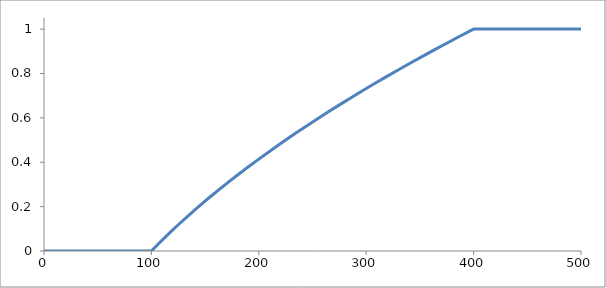
| Category | Series 0 |
|---|---|
| 0.0 | 0 |
| 100.0 | 0 |
| 106.34765625 | 0.031 |
| 112.890625 | 0.062 |
| 119.62890625 | 0.094 |
| 126.5625 | 0.125 |
| 133.69140625 | 0.156 |
| 141.015625 | 0.188 |
| 148.53515625 | 0.219 |
| 156.25 | 0.25 |
| 164.16015625 | 0.281 |
| 172.265625 | 0.312 |
| 180.56640625 | 0.344 |
| 189.0625 | 0.375 |
| 197.75390625 | 0.406 |
| 206.640625 | 0.438 |
| 215.72265625 | 0.469 |
| 225.0 | 0.5 |
| 234.47265625 | 0.531 |
| 244.140625 | 0.562 |
| 254.00390625 | 0.594 |
| 264.0625 | 0.625 |
| 274.31640625 | 0.656 |
| 284.765625 | 0.688 |
| 295.41015625 | 0.719 |
| 306.25 | 0.75 |
| 317.28515625 | 0.781 |
| 328.515625 | 0.812 |
| 339.94140625 | 0.844 |
| 351.5625 | 0.875 |
| 363.37890625 | 0.906 |
| 375.390625 | 0.938 |
| 387.59765625 | 0.969 |
| 400.0 | 1 |
| 500.0 | 1 |